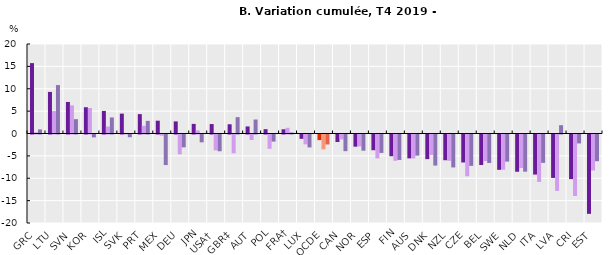
| Category | Faible rémunération | Rémunération intermédiaire | Rémunération élevée |
|---|---|---|---|
| GRC | 15.733 | 0.277 | 0.914 |
| LTU | 9.292 | 5.011 | 10.821 |
| SVN | 7.049 | 6.288 | 3.206 |
| KOR | 5.873 | 5.704 | -0.647 |
| ISL | 5.044 | 1.547 | 3.589 |
| SVK | 4.442 | 0.141 | -0.61 |
| PRT | 4.336 | 1.719 | 2.819 |
| MEX | 2.862 | -0.272 | -6.829 |
| DEU | 2.706 | -4.43 | -2.871 |
| JPN | 2.148 | 0.691 | -1.751 |
| USA† | 2.115 | -3.534 | -3.745 |
| GBR‡ | 2.064 | -4.195 | 3.654 |
| AUT | 1.578 | -1.227 | 3.126 |
| POL | 0.967 | -3.201 | -1.589 |
| FRA† | 0.947 | 1.274 | 0.228 |
| LUX | -0.966 | -2.205 | -2.888 |
| OCDE | -1.252 | -3.316 | -2.224 |
| CAN | -1.681 | -1.101 | -3.721 |
| NOR | -2.72 | -2.654 | -3.615 |
| ESP | -3.514 | -5.343 | -4.121 |
| FIN | -4.859 | -5.874 | -5.69 |
| AUS | -5.334 | -5.346 | -4.721 |
| DNK | -5.503 | -4.575 | -6.943 |
| NZL | -5.747 | -5.883 | -7.359 |
| CZE | -6.253 | -9.338 | -7.012 |
| BEL | -6.822 | -5.943 | -6.375 |
| SWE | -7.896 | -7.859 | -6.052 |
| NLD | -8.327 | -7.494 | -8.306 |
| ITA | -8.954 | -10.6 | -6.343 |
| LVA | -9.704 | -12.588 | 1.858 |
| CRI | -9.966 | -13.738 | -1.996 |
| EST | -17.732 | -8.051 | -5.965 |